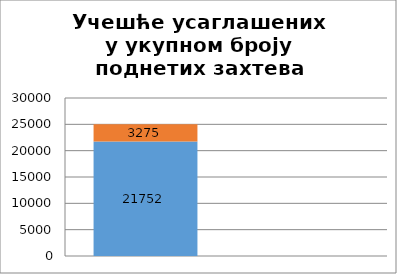
| Category | Број поднетих захтева | Број поднетих усаглашених захтева |
|---|---|---|
| 0 | 21752 | 3275 |
| 1 | 0.869 | 0.151 |